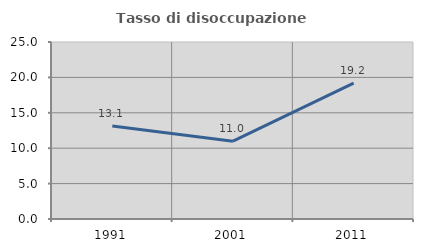
| Category | Tasso di disoccupazione giovanile  |
|---|---|
| 1991.0 | 13.128 |
| 2001.0 | 10.989 |
| 2011.0 | 19.192 |